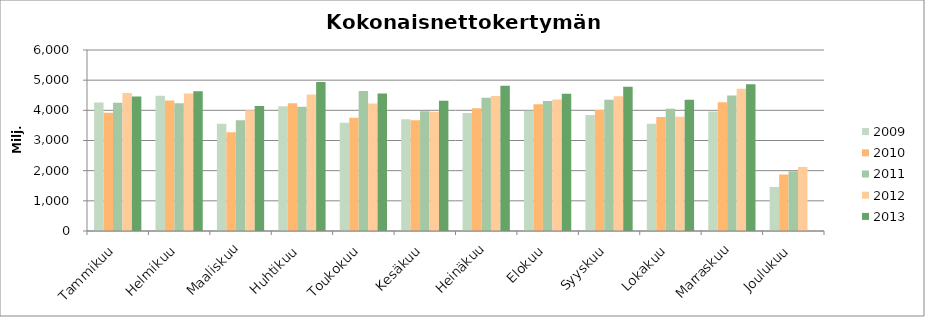
| Category | 2009 | 2010 | 2011 | 2012 | 2013 |
|---|---|---|---|---|---|
| Tammikuu | 4262.104 | 3920.596 | 4254.457 | 4574.273 | 4458.574 |
| Helmikuu | 4482.61 | 4324.273 | 4236.531 | 4556.683 | 4631.184 |
| Maaliskuu | 3551.222 | 3273.1 | 3667.911 | 4003.705 | 4141.995 |
| Huhtikuu | 4137.11 | 4235.283 | 4118.677 | 4521.853 | 4938.018 |
| Toukokuu | 3589.232 | 3758.246 | 4645.002 | 4229.781 | 4554.199 |
| Kesäkuu | 3701.617 | 3667.134 | 3966.073 | 3950.962 | 4320.908 |
| Heinäkuu | 3908.058 | 4070.751 | 4417.867 | 4473.488 | 4813.288 |
| Elokuu | 3983.999 | 4202.024 | 4310.334 | 4361.243 | 4548.338 |
| Syyskuu | 3843.197 | 4009.059 | 4353.55 | 4465.954 | 4780.078 |
| Lokakuu | 3558.554 | 3781.91 | 4052.329 | 3783.435 | 4353.533 |
| Marraskuu | 3964.456 | 4269.91 | 4491.275 | 4716.744 | 4864.184 |
| Joulukuu | 1461.632 | 1872.231 | 1978.993 | 2124.114 | 0 |